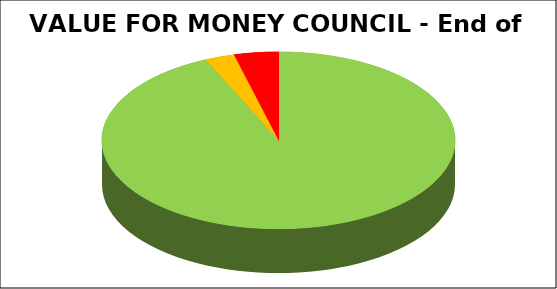
| Category | Series 0 |
|---|---|
| Green | 0.932 |
| Amber | 0.027 |
| Red | 0.041 |